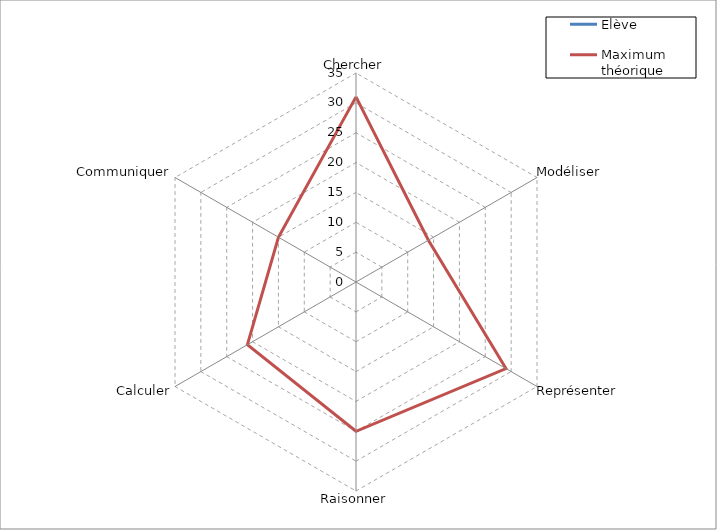
| Category | Elève | Maximum théorique |
|---|---|---|
| Chercher | 0 | 31 |
| Modéliser | 0 | 14 |
| Représenter | 0 | 29 |
| Raisonner | 0 | 25 |
| Calculer | 0 | 21 |
| Communiquer | 0 | 15 |